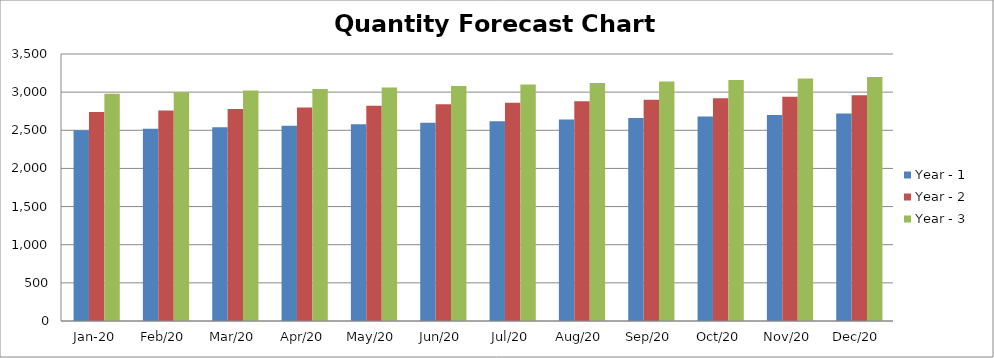
| Category | Year - 1 | Year - 2 | Year - 3 |
|---|---|---|---|
| 2020-01-01 | 2500 | 2740 | 2980 |
| 2020-02-01 | 2520 | 2760 | 3000 |
| 2020-03-01 | 2540 | 2780 | 3020 |
| 2020-04-01 | 2560 | 2800 | 3040 |
| 2020-05-01 | 2580 | 2820 | 3060 |
| 2020-06-01 | 2600 | 2840 | 3080 |
| 2020-07-01 | 2620 | 2860 | 3100 |
| 2020-08-01 | 2640 | 2880 | 3120 |
| 2020-09-01 | 2660 | 2900 | 3140 |
| 2020-10-01 | 2680 | 2920 | 3160 |
| 2020-11-01 | 2700 | 2940 | 3180 |
| 2020-12-01 | 2720 | 2960 | 3200 |